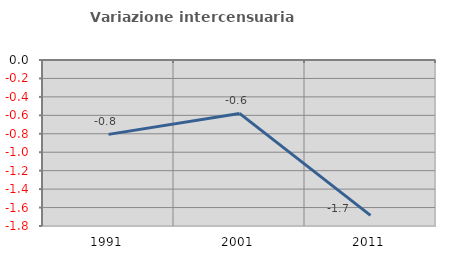
| Category | Variazione intercensuaria annua |
|---|---|
| 1991.0 | -0.806 |
| 2001.0 | -0.579 |
| 2011.0 | -1.685 |